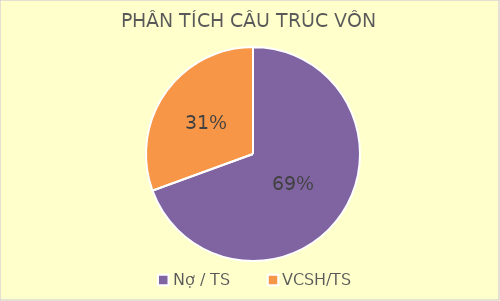
| Category | Series 0 |
|---|---|
| Nợ / TS | 0.694 |
| VCSH/TS | 0.306 |